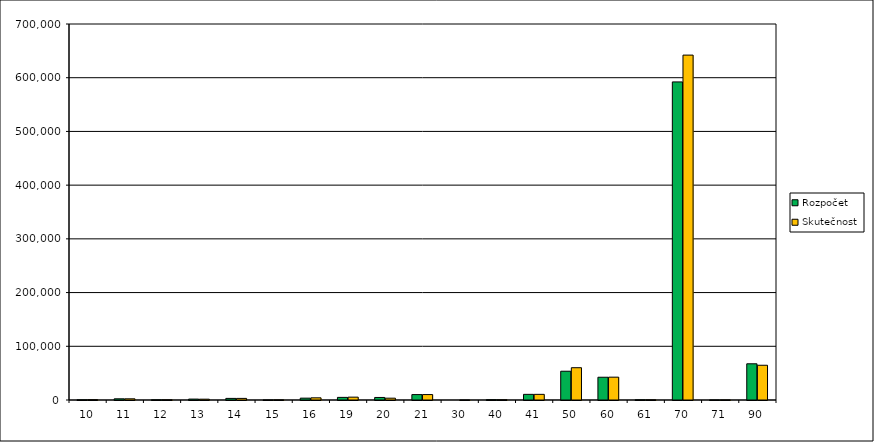
| Category | Rozpočet | Skutečnost |
|---|---|---|
| 10.0 | 354.4 | 623.47 |
| 11.0 | 2222 | 2213.85 |
| 12.0 | 366.87 | 416.87 |
| 13.0 | 1702 | 1514.04 |
| 14.0 | 2979.04 | 2985.36 |
| 15.0 | 120 | 302.17 |
| 16.0 | 3450 | 4050.73 |
| 19.0 | 4880 | 5322.25 |
| 20.0 | 4715.32 | 3390.14 |
| 21.0 | 10082.68 | 10095.08 |
| 30.0 | 0 | 0.03 |
| 40.0 | 624.64 | 508.61 |
| 41.0 | 10525 | 10522.84 |
| 50.0 | 53573.79 | 60117.29 |
| 60.0 | 42372.66 | 42520.86 |
| 61.0 | 400 | 400 |
| 70.0 | 592191.76 | 642090.37 |
| 71.0 | 97 | 147.05 |
| 90.0 | 67421.22 | 64691.38 |